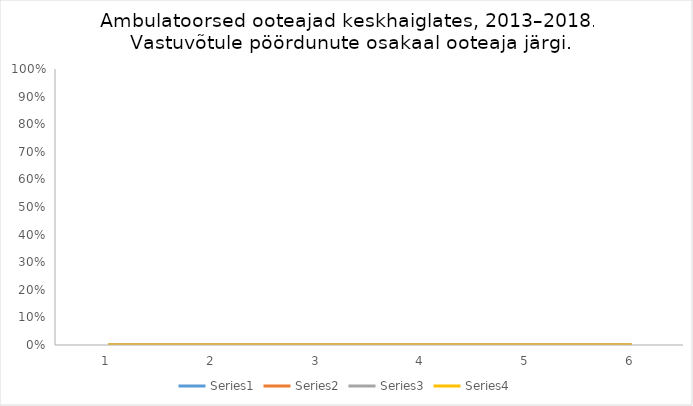
| Category | Series 0 | Series 1 | Series 2 | Series 3 |
|---|---|---|---|---|
| 0 | 0.119 | 0.196 | 0.37 | 0.316 |
| 1 | 0.132 | 0.206 | 0.369 | 0.293 |
| 2 | 0.135 | 0.202 | 0.357 | 0.305 |
| 3 | 0.14 | 0.21 | 0.36 | 0.29 |
| 4 | 0.12 | 0.21 | 0.37 | 0.29 |
| 5 | 0.12 | 0.2 | 0.38 | 0.3 |